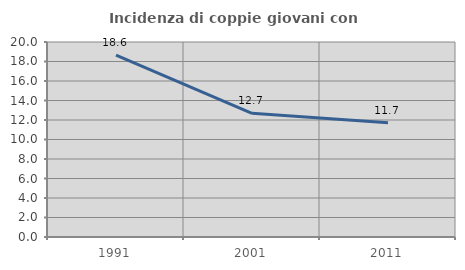
| Category | Incidenza di coppie giovani con figli |
|---|---|
| 1991.0 | 18.644 |
| 2001.0 | 12.69 |
| 2011.0 | 11.71 |